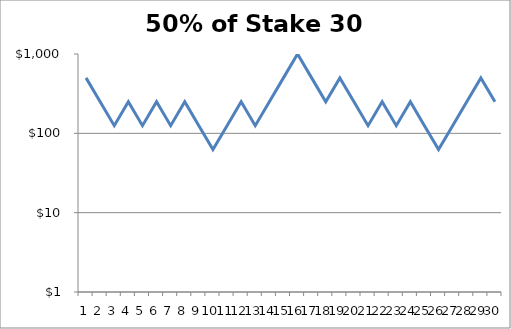
| Category | Series 0 |
|---|---|
| 0 | 500 |
| 1 | 250 |
| 2 | 125 |
| 3 | 250 |
| 4 | 125 |
| 5 | 250 |
| 6 | 125 |
| 7 | 250 |
| 8 | 125 |
| 9 | 62.5 |
| 10 | 125 |
| 11 | 250 |
| 12 | 125 |
| 13 | 250 |
| 14 | 500 |
| 15 | 1000 |
| 16 | 500 |
| 17 | 250 |
| 18 | 500 |
| 19 | 250 |
| 20 | 125 |
| 21 | 250 |
| 22 | 125 |
| 23 | 250 |
| 24 | 125 |
| 25 | 62.5 |
| 26 | 125 |
| 27 | 250 |
| 28 | 500 |
| 29 | 250 |